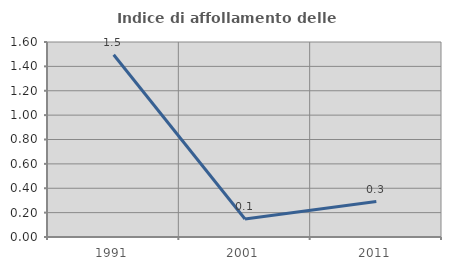
| Category | Indice di affollamento delle abitazioni  |
|---|---|
| 1991.0 | 1.495 |
| 2001.0 | 0.148 |
| 2011.0 | 0.291 |